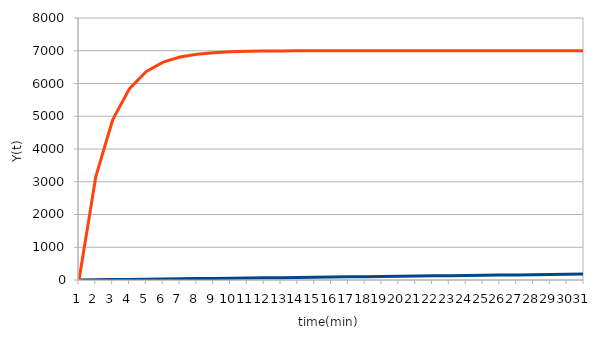
| Category | Series 0 | Series 1 |
|---|---|---|
| 0 | 0 | 0 |
| 1 | 6 | 3158.319 |
| 2 | 12 | 4891.641 |
| 3 | 18 | 5842.908 |
| 4 | 24 | 6364.974 |
| 5 | 30 | 6651.491 |
| 6 | 36 | 6808.734 |
| 7 | 42 | 6895.031 |
| 8 | 48 | 6942.392 |
| 9 | 54 | 6968.384 |
| 10 | 60 | 6982.649 |
| 11 | 66 | 6990.477 |
| 12 | 72 | 6994.774 |
| 13 | 78 | 6997.132 |
| 14 | 84 | 6998.426 |
| 15 | 90 | 6999.136 |
| 16 | 96 | 6999.526 |
| 17 | 102 | 6999.74 |
| 18 | 108 | 6999.857 |
| 19 | 114 | 6999.922 |
| 20 | 120 | 6999.957 |
| 21 | 126 | 6999.976 |
| 22 | 132 | 6999.987 |
| 23 | 138 | 6999.993 |
| 24 | 144 | 6999.996 |
| 25 | 150 | 6999.998 |
| 26 | 156 | 6999.999 |
| 27 | 162 | 6999.999 |
| 28 | 168 | 7000 |
| 29 | 174 | 7000 |
| 30 | 180 | 7000 |